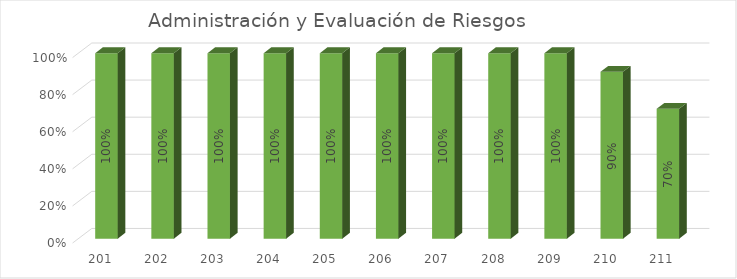
| Category | % Avance |
|---|---|
| 201.0 | 1 |
| 202.0 | 1 |
| 203.0 | 1 |
| 204.0 | 1 |
| 205.0 | 1 |
| 206.0 | 1 |
| 207.0 | 1 |
| 208.0 | 1 |
| 209.0 | 1 |
| 210.0 | 0.9 |
| 211.0 | 0.7 |